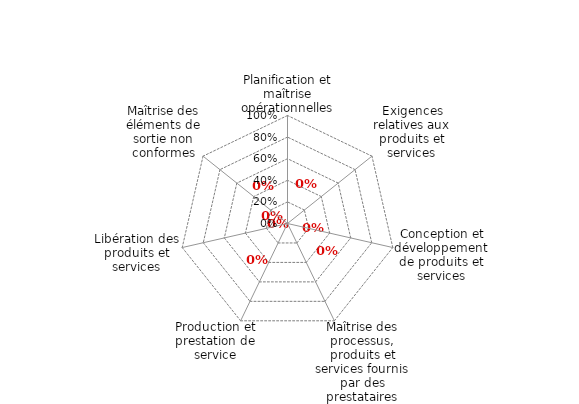
| Category | Article 4 |
|---|---|
| 0 | 0 |
| 1 | 0 |
| 2 | 0 |
| 3 | 0 |
| 4 | 0 |
| 5 | 0 |
| 6 | 0 |